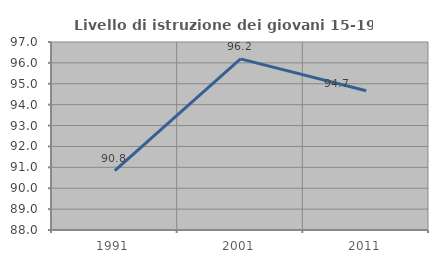
| Category | Livello di istruzione dei giovani 15-19 anni |
|---|---|
| 1991.0 | 90.84 |
| 2001.0 | 96.19 |
| 2011.0 | 94.667 |